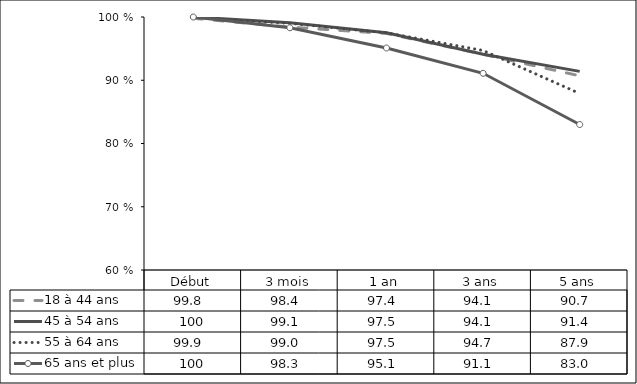
| Category | 18 à 44 ans  | 45 à 54 ans  | 55 à 64 ans  | 65 ans et plus  |
|---|---|---|---|---|
| Début | 99.8 | 100 | 99.9 | 100 |
| 3 mois | 98.4 | 99.1 | 99 | 98.3 |
| 1 an | 97.4 | 97.5 | 97.5 | 95.1 |
| 3 ans | 94.1 | 94.1 | 94.7 | 91.1 |
| 5 ans | 90.7 | 91.4 | 87.9 | 83 |